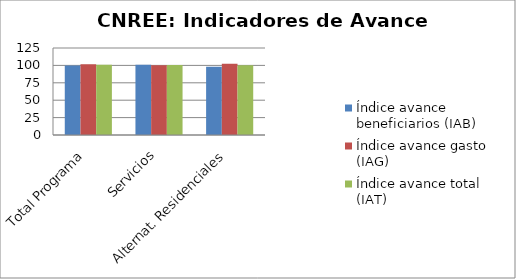
| Category | Índice avance beneficiarios (IAB)  | Índice avance gasto (IAG) | Índice avance total (IAT)  |
|---|---|---|---|
| Total Programa | 100.028 | 101.823 | 100.925 |
| Servicios | 100.773 | 100.311 | 100.542 |
| Alternat. Residenciales | 98.055 | 102.54 | 100.298 |